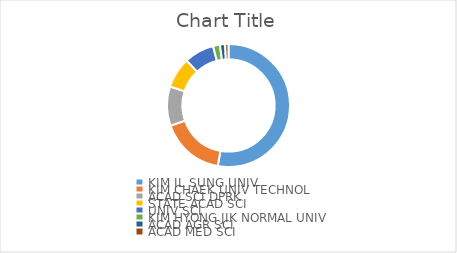
| Category | Series 0 |
|---|---|
| KIM IL SUNG UNIV | 235 |
| KIM CHAEK UNIV TECHNOL | 75 |
| ACAD SCI DPRK | 46 |
| STATE ACAD SCI | 36 |
| UNIV SCI | 35 |
| KIM HYONG JIK NORMAL UNIV | 8 |
| ACAD AGR SCI | 6 |
| ACAD MED SCI | 4 |